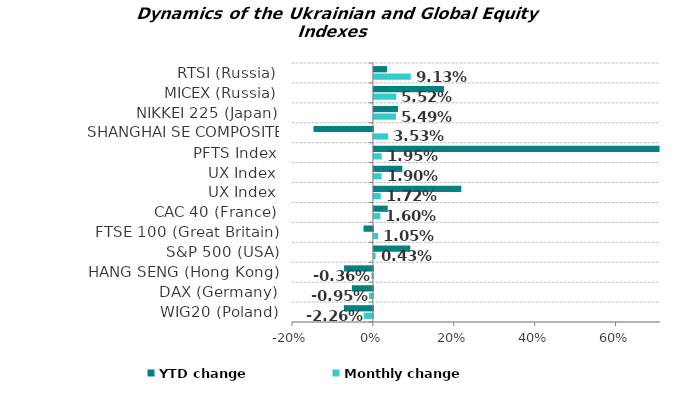
| Category | Monthly change | YTD change |
|---|---|---|
| WIG20 (Poland) | -0.023 | -0.072 |
| DAX (Germany) | -0.009 | -0.052 |
| HANG SENG (Hong Kong) | -0.004 | -0.071 |
| S&P 500 (USA) | 0.004 | 0.09 |
| FTSE 100 (Great Britain) | 0.01 | -0.023 |
| CAC 40 (France) | 0.016 | 0.034 |
| UX Index | 0.017 | 0.216 |
| UX Index | 0.019 | 0.07 |
| PFTS Index | 0.019 | 0.706 |
| SHANGHAI SE COMPOSITE (China) | 0.035 | -0.147 |
| NIKKEI 225 (Japan) | 0.055 | 0.06 |
| MICEX (Russia) | 0.055 | 0.173 |
| RTSI (Russia) | 0.091 | 0.033 |